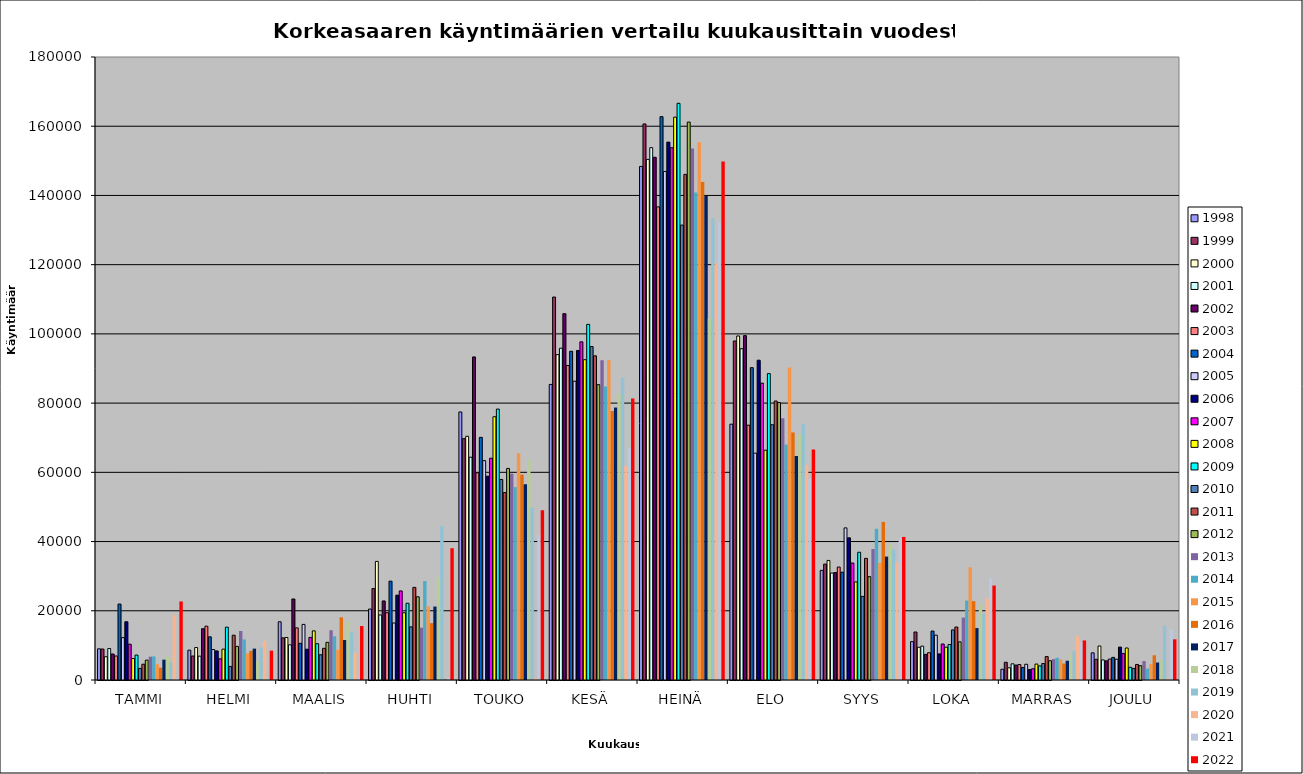
| Category | 1998 | 1999 | 2000 | 2001 | 2002 | 2003 | 2004 | 2005 | 2006 | 2007 | 2008 | 2009 | 2010 | 2011 | 2012 | 2013 | 2014 | 2015 | 2016 | 2017 | 2018 | 2019 | 2020 | 2021 | 2022 |
|---|---|---|---|---|---|---|---|---|---|---|---|---|---|---|---|---|---|---|---|---|---|---|---|---|---|
| TAMMI | 9003 | 8949 | 6721 | 9085 | 7513 | 6938 | 21941 | 12240 | 16829 | 10354 | 6207 | 7204 | 3344 | 4556 | 5742 | 6730 | 6803 | 4556 | 3553 | 5871 | 6731 | 5088 | 18749 | 367 | 22695 |
| HELMI | 8616 | 6929 | 9374 | 6889 | 14809 | 15538 | 12473 | 8806 | 8403 | 6124 | 8913 | 15264 | 3926 | 12940 | 9712 | 14162 | 11731 | 7718 | 8420 | 9065 | 5400 | 9398 | 11286 | 281 | 8485 |
| MAALIS | 16822 | 12178 | 12271 | 10154 | 23403 | 15061 | 10599 | 16063 | 8894 | 12301 | 14193 | 10485 | 7285 | 9159 | 10876 | 14378 | 12628 | 8744 | 18108 | 11558 | 16983 | 13710 | 7892 | 410 | 15581 |
| HUHTI | 20503 | 26415 | 34262 | 18785 | 22841 | 19435 | 28549 | 16469 | 24514 | 25732 | 19422 | 22177 | 15354 | 26760 | 24039 | 15113 | 28569 | 21260 | 16429 | 21218 | 29770 | 44534 | 0 | 656 | 38072 |
| TOUKO | 77447 | 69728 | 70416 | 64361 | 93342 | 59874 | 70105 | 63378 | 58885 | 64080 | 76060 | 78270 | 57940 | 54150 | 61128 | 59619 | 55728 | 65517 | 59352 | 56562 | 63742 | 49864 | 452 | 41880 | 49014 |
| KESÄ | 85396 | 110647 | 94011 | 95856 | 105846 | 90873 | 94967 | 86333 | 95209 | 97709 | 92546 | 102745 | 96356 | 93655 | 85315 | 92408 | 84776 | 92488 | 77746 | 78738 | 82610 | 87301 | 61851 | 67157 | 81354 |
| HEINÄ | 148381 | 160652 | 150414 | 153801 | 151023 | 136697 | 162767 | 146930 | 155408 | 153796 | 162622 | 166623 | 131430 | 146090 | 161200 | 153545 | 140821 | 155375 | 143900 | 139867 | 104478 | 133418 | 120384 | 132229 | 149810 |
| ELO | 73915 | 97951 | 99397 | 95712 | 99497 | 73619 | 90242 | 65538 | 92396 | 85757 | 66395 | 88526 | 73749 | 80605 | 80163 | 75614 | 67993 | 90282 | 71532 | 64730 | 70815 | 74073 | 62057 | 58316 | 66606 |
| SYYS | 31680 | 33482 | 34547 | 30910 | 31054 | 32636 | 31149 | 43946 | 41081 | 33799 | 28340 | 36910 | 24154 | 35137 | 29849 | 37836 | 43684 | 33817 | 45679 | 35657 | 39128 | 37650 | 34016 | 41060 | 41331 |
| LOKA | 11086 | 13869 | 9457 | 9780 | 7402 | 7887 | 14139 | 12949 | 7539 | 10396 | 9481 | 10251 | 14470 | 15304 | 11024 | 18035 | 22963 | 32558 | 22781 | 15004 | 21923 | 19209 | 23526 | 29470 | 27291 |
| MARRAS | 3104 | 5119 | 3525 | 4671 | 4310 | 4462 | 3621 | 4548 | 3007 | 3247 | 4602 | 4067 | 4767 | 6776 | 5566 | 6054 | 6427 | 5969 | 4749 | 5566 | 7739 | 8319 | 12633 | 10864 | 11436 |
| JOULU | 7849 | 5980 | 9818 | 5796 | 5534 | 6039 | 6535 | 6002 | 9506 | 7668 | 9250 | 3679 | 3360 | 4489 | 4123 | 5467 | 3277 | 4634 | 7145 | 5046 | 5764 | 15702 | 348 | 14596 | 11752 |